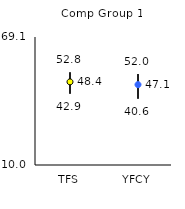
| Category | 25th | 75th | Mean |
|---|---|---|---|
| TFS | 42.9 | 52.8 | 48.38 |
| YFCY | 40.6 | 52 | 47.11 |